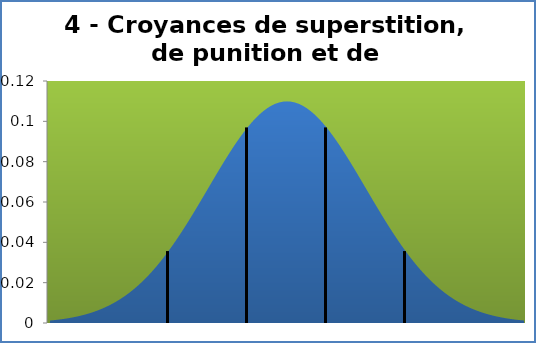
| Category | Series 1 |
|---|---|
| -1.1599999999999984 | 0.001 |
| -0.9784999999999986 | 0.001 |
| -0.7969999999999988 | 0.002 |
| -0.615499999999999 | 0.002 |
| -0.4339999999999993 | 0.002 |
| -0.2524999999999995 | 0.003 |
| -0.07099999999999795 | 0.003 |
| 0.11050000000000182 | 0.003 |
| 0.2920000000000016 | 0.004 |
| 0.47350000000000136 | 0.004 |
| 0.6550000000000011 | 0.005 |
| 0.8365000000000009 | 0.005 |
| 1.0180000000000007 | 0.006 |
| 1.1995000000000005 | 0.007 |
| 1.3810000000000002 | 0.008 |
| 1.5625 | 0.009 |
| 1.7440000000000007 | 0.01 |
| 1.9255000000000004 | 0.011 |
| 2.107 | 0.012 |
| 2.288500000000001 | 0.013 |
| 2.4700000000000006 | 0.015 |
| 2.6515000000000004 | 0.016 |
| 2.833 | 0.018 |
| 3.0145 | 0.02 |
| 3.1959999999999997 | 0.022 |
| 3.3775000000000004 | 0.024 |
| 3.559 | 0.026 |
| 3.740500000000001 | 0.028 |
| 3.9220000000000006 | 0.031 |
| 4.1035 | 0.033 |
| 4.285000000000001 | 0.036 |
| 4.466500000000001 | 0.038 |
| 4.648000000000001 | 0.041 |
| 4.829500000000001 | 0.044 |
| 5.011000000000001 | 0.047 |
| 5.192500000000001 | 0.05 |
| 5.3740000000000006 | 0.053 |
| 5.5555 | 0.057 |
| 5.737 | 0.06 |
| 5.9185 | 0.063 |
| 6.1000000000000005 | 0.067 |
| 6.2815 | 0.07 |
| 6.463 | 0.073 |
| 6.644500000000001 | 0.077 |
| 6.8260000000000005 | 0.08 |
| 7.0075 | 0.083 |
| 7.189 | 0.086 |
| 7.370500000000001 | 0.089 |
| 7.5520000000000005 | 0.092 |
| 7.7335 | 0.094 |
| 7.915000000000001 | 0.097 |
| 8.0965 | 0.099 |
| 8.278 | 0.101 |
| 8.4595 | 0.103 |
| 8.641 | 0.105 |
| 8.8225 | 0.107 |
| 9.004000000000001 | 0.108 |
| 9.185500000000001 | 0.109 |
| 9.367 | 0.109 |
| 9.5485 | 0.11 |
| 9.73 | 0.11 |
| 9.9115 | 0.11 |
| 10.093 | 0.109 |
| 10.2745 | 0.109 |
| 10.456 | 0.108 |
| 10.637500000000001 | 0.107 |
| 10.819 | 0.105 |
| 11.0005 | 0.103 |
| 11.182 | 0.101 |
| 11.3635 | 0.099 |
| 11.545 | 0.097 |
| 11.7265 | 0.094 |
| 11.908000000000001 | 0.092 |
| 12.089500000000001 | 0.089 |
| 12.271 | 0.086 |
| 12.4525 | 0.083 |
| 12.634 | 0.08 |
| 12.8155 | 0.077 |
| 12.997 | 0.073 |
| 13.1785 | 0.07 |
| 13.36 | 0.067 |
| 13.541500000000001 | 0.063 |
| 13.723 | 0.06 |
| 13.9045 | 0.057 |
| 14.086 | 0.053 |
| 14.2675 | 0.05 |
| 14.449 | 0.047 |
| 14.6305 | 0.044 |
| 14.812000000000001 | 0.041 |
| 14.993500000000001 | 0.038 |
| 15.175 | 0.036 |
| 15.3565 | 0.033 |
| 15.538 | 0.031 |
| 15.7195 | 0.028 |
| 15.901 | 0.026 |
| 16.0825 | 0.024 |
| 16.264000000000003 | 0.022 |
| 16.445500000000003 | 0.02 |
| 16.627000000000002 | 0.018 |
| 16.808500000000002 | 0.016 |
| 16.990000000000002 | 0.015 |
| 17.1715 | 0.013 |
| 17.353 | 0.012 |
| 17.5345 | 0.011 |
| 17.716 | 0.01 |
| 17.8975 | 0.009 |
| 18.079 | 0.008 |
| 18.2605 | 0.007 |
| 18.442 | 0.006 |
| 18.6235 | 0.005 |
| 18.805 | 0.005 |
| 18.9865 | 0.004 |
| 19.168 | 0.004 |
| 19.3495 | 0.003 |
| 19.531 | 0.003 |
| 19.7125 | 0.003 |
| 19.894 | 0.002 |
| 20.075499999999998 | 0.002 |
| 20.256999999999998 | 0.002 |
| 20.438499999999998 | 0.001 |
| 20.619999999999997 | 0.001 |